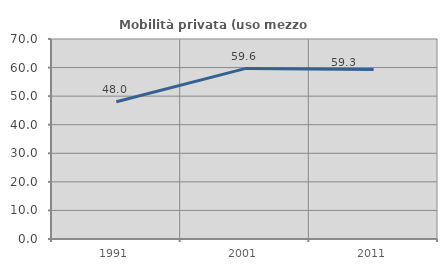
| Category | Mobilità privata (uso mezzo privato) |
|---|---|
| 1991.0 | 48.022 |
| 2001.0 | 59.632 |
| 2011.0 | 59.324 |